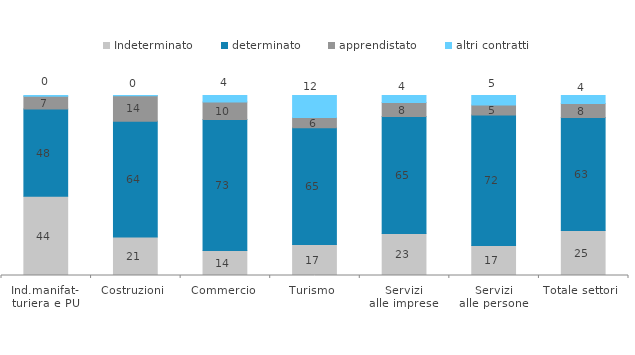
| Category | Indeterminato | determinato | apprendistato | altri contratti |
|---|---|---|---|---|
| Ind.manifat-
turiera e PU | 44.069 | 48.439 | 7.128 | 0.364 |
| Costruzioni | 21.429 | 64.286 | 14.134 | 0.152 |
| Commercio | 13.827 | 72.881 | 9.723 | 3.568 |
| Turismo | 17.176 | 64.932 | 5.66 | 12.232 |
| Servizi
alle imprese | 23.38 | 64.958 | 7.718 | 3.944 |
| Servizi
alle persone | 16.73 | 72.497 | 5.45 | 5.323 |
| Totale settori | 25.045 | 62.728 | 7.767 | 4.46 |